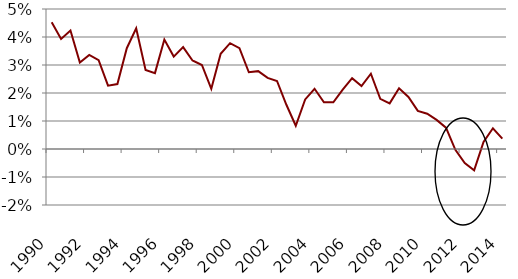
| Category | Series 0 |
|---|---|
| 1990.0 | 0.045 |
| nan | 0.039 |
| 1991.0 | 0.042 |
| nan | 0.031 |
| 1992.0 | 0.034 |
| nan | 0.032 |
| 1993.0 | 0.023 |
| nan | 0.023 |
| 1994.0 | 0.036 |
| nan | 0.043 |
| 1995.0 | 0.028 |
| nan | 0.027 |
| 1996.0 | 0.039 |
| nan | 0.033 |
| 1997.0 | 0.036 |
| nan | 0.032 |
| 1998.0 | 0.03 |
| nan | 0.022 |
| 1999.0 | 0.034 |
| nan | 0.038 |
| 2000.0 | 0.036 |
| nan | 0.027 |
| 2001.0 | 0.028 |
| nan | 0.025 |
| 2002.0 | 0.024 |
| nan | 0.016 |
| 2003.0 | 0.008 |
| nan | 0.018 |
| 2004.0 | 0.022 |
| nan | 0.017 |
| 2005.0 | 0.017 |
| nan | 0.021 |
| 2006.0 | 0.025 |
| nan | 0.022 |
| 2007.0 | 0.027 |
| nan | 0.018 |
| 2008.0 | 0.016 |
| nan | 0.022 |
| 2009.0 | 0.019 |
| nan | 0.014 |
| 2010.0 | 0.013 |
| nan | 0.01 |
| 2011.0 | 0.008 |
| nan | 0 |
| 2012.0 | -0.005 |
| nan | -0.008 |
| 2013.0 | 0.002 |
| nan | 0.007 |
| 2014.0 | 0.004 |